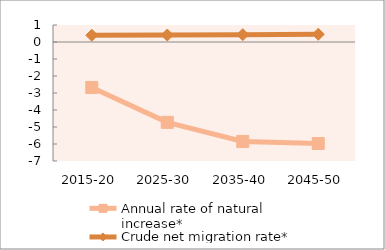
| Category | Annual rate of natural increase* | Crude net migration rate* |
|---|---|---|
| 2015-20 | -2.675 | 0.397 |
| 2025-30 | -4.726 | 0.41 |
| 2035-40 | -5.849 | 0.431 |
| 2045-50 | -5.971 | 0.455 |